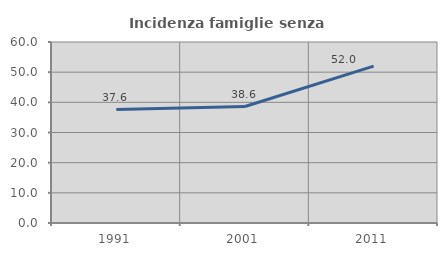
| Category | Incidenza famiglie senza nuclei |
|---|---|
| 1991.0 | 37.597 |
| 2001.0 | 38.61 |
| 2011.0 | 52 |